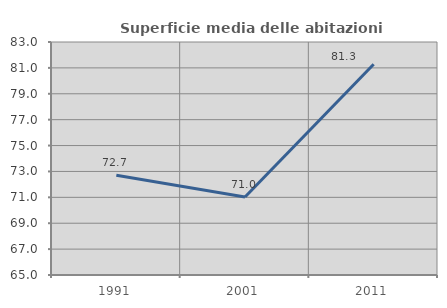
| Category | Superficie media delle abitazioni occupate |
|---|---|
| 1991.0 | 72.702 |
| 2001.0 | 71.026 |
| 2011.0 | 81.278 |